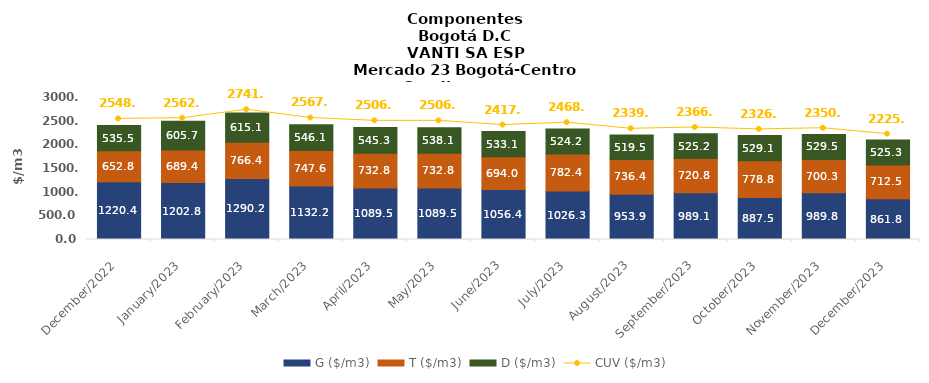
| Category | G ($/m3) | T ($/m3) | D ($/m3) |
|---|---|---|---|
| 2022-12-01 | 1220.44 | 652.77 | 535.5 |
| 2023-01-01 | 1202.77 | 689.37 | 605.73 |
| 2023-02-01 | 1290.19 | 766.35 | 615.06 |
| 2023-03-01 | 1132.24 | 747.55 | 546.05 |
| 2023-04-01 | 1089.52 | 732.84 | 545.26 |
| 2023-05-01 | 1089.52 | 732.84 | 538.11 |
| 2023-06-01 | 1056.38 | 694.03 | 533.13 |
| 2023-07-01 | 1026.28 | 782.44 | 524.19 |
| 2023-08-01 | 953.86 | 736.37 | 519.49 |
| 2023-09-01 | 989.12 | 720.82 | 525.15 |
| 2023-10-01 | 887.54 | 778.8 | 529.13 |
| 2023-11-01 | 989.81 | 700.33 | 529.5 |
| 2023-12-01 | 861.8 | 712.5 | 525.3 |